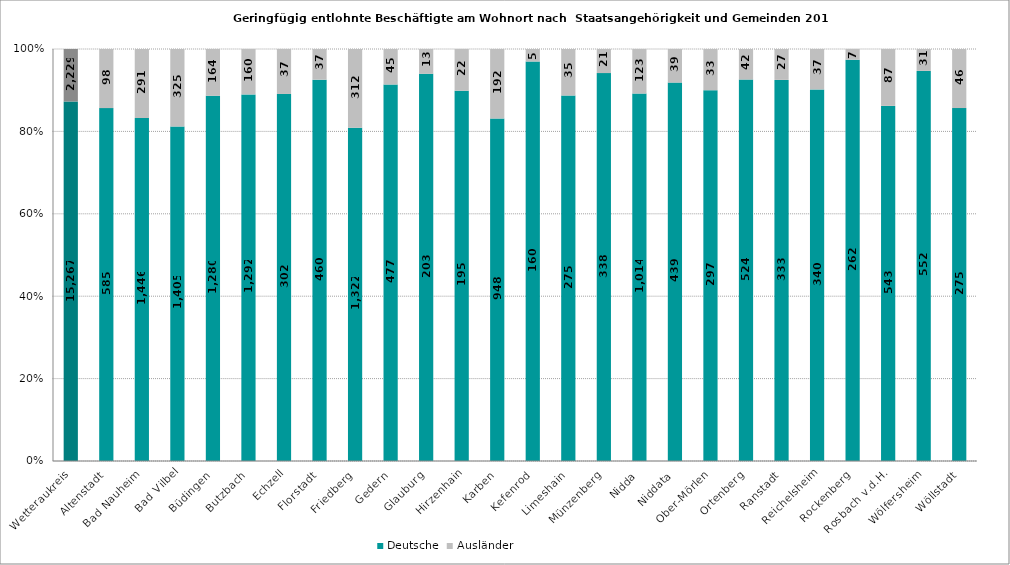
| Category | Deutsche | Ausländer |
|---|---|---|
| Wetteraukreis | 15267 | 2229 |
| Altenstadt | 585 | 98 |
| Bad Nauheim | 1446 | 291 |
| Bad Vilbel | 1405 | 325 |
| Büdingen | 1280 | 164 |
| Butzbach | 1292 | 160 |
| Echzell | 302 | 37 |
| Florstadt | 460 | 37 |
| Friedberg | 1322 | 312 |
| Gedern | 477 | 45 |
| Glauburg | 203 | 13 |
| Hirzenhain | 195 | 22 |
| Karben | 948 | 192 |
| Kefenrod | 160 | 5 |
| Limeshain | 275 | 35 |
| Münzenberg | 338 | 21 |
| Nidda | 1014 | 123 |
| Niddata | 439 | 39 |
| Ober-Mörlen | 297 | 33 |
| Ortenberg | 524 | 42 |
| Ranstadt | 333 | 27 |
| Reichelsheim | 340 | 37 |
| Rockenberg | 262 | 7 |
| Rosbach v.d.H. | 543 | 87 |
| Wölfersheim | 552 | 31 |
| Wöllstadt | 275 | 46 |